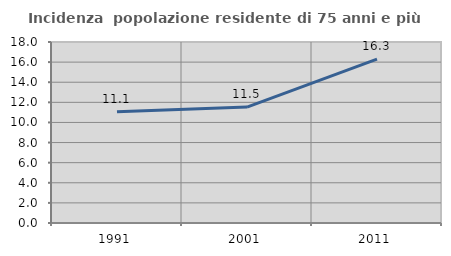
| Category | Incidenza  popolazione residente di 75 anni e più |
|---|---|
| 1991.0 | 11.054 |
| 2001.0 | 11.53 |
| 2011.0 | 16.304 |